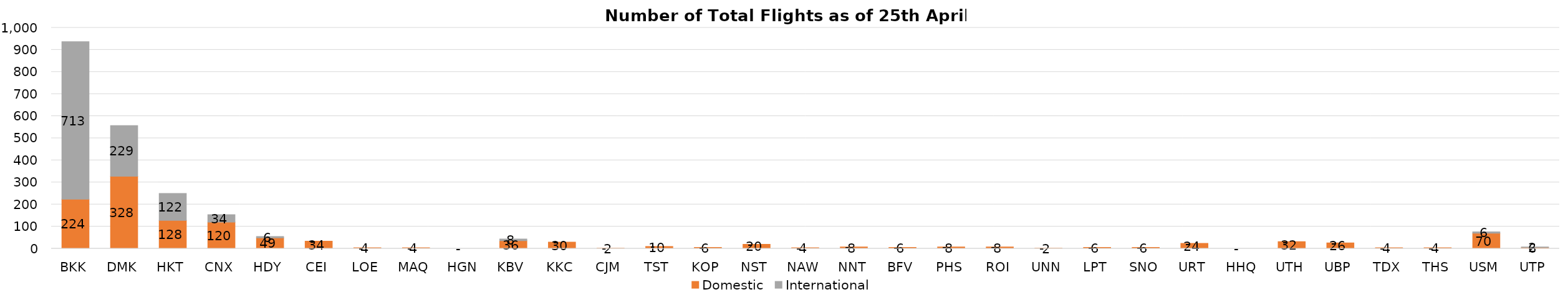
| Category | Domestic | International |
|---|---|---|
| BKK | 224 | 713 |
| DMK | 328 | 229 |
| HKT | 128 | 122 |
| CNX | 120 | 34 |
| HDY | 49 | 6 |
| CEI | 34 | 0 |
| LOE | 4 | 0 |
| MAQ | 4 | 0 |
| HGN | 0 | 0 |
| KBV | 36 | 8 |
| KKC | 30 | 0 |
| CJM | 2 | 0 |
| TST | 10 | 0 |
| KOP | 6 | 0 |
| NST | 20 | 0 |
| NAW | 4 | 0 |
| NNT | 8 | 0 |
| BFV | 6 | 0 |
| PHS | 8 | 0 |
| ROI | 8 | 0 |
| UNN | 2 | 0 |
| LPT | 6 | 0 |
| SNO | 6 | 0 |
| URT | 24 | 0 |
| HHQ | 0 | 0 |
| UTH | 32 | 0 |
| UBP | 26 | 0 |
| TDX | 4 | 0 |
| THS | 4 | 0 |
| USM | 70 | 6 |
| UTP | 6 | 2 |